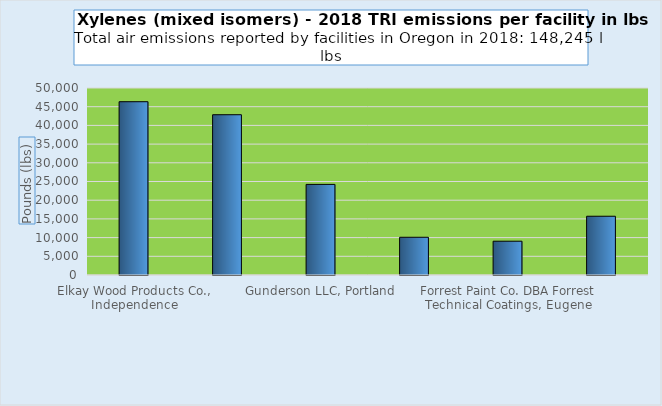
| Category | Series 0 |
|---|---|
| Elkay Wood Products Co., Independence | 46335 |
| Vigor Industrial, Portland | 42852 |
| Gunderson LLC, Portland | 24224 |
| Hydro Extrusion Portland Inc - Coatings Div, Portland | 10087 |
| Forrest Paint Co. DBA Forrest Technical Coatings, Eugene | 9036 |
| 10 other facilities | 15711 |